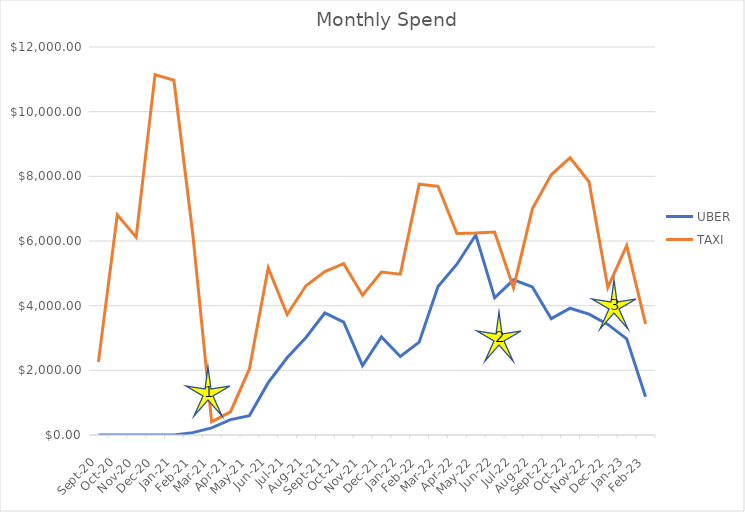
| Category | UBER | TAXI |
|---|---|---|
| 2020-09-01 | 0 | 2261.5 |
| 2020-10-01 | 0 | 6810.3 |
| 2020-11-01 | 0 | 6119.6 |
| 2020-12-01 | 0 | 11144.6 |
| 2021-01-01 | 0 | 10971.5 |
| 2021-02-01 | 73.1 | 6218 |
| 2021-03-01 | 218.64 | 406.5 |
| 2021-04-01 | 476.11 | 714 |
| 2021-05-01 | 598.13 | 2043 |
| 2021-06-01 | 1618.72 | 5170.3 |
| 2021-07-01 | 2388.37 | 3724.5 |
| 2021-08-01 | 3017.75 | 4617.5 |
| 2021-09-01 | 3774.34 | 5056.5 |
| 2021-10-01 | 3492.27 | 5300.3 |
| 2021-11-01 | 2147.85 | 4323.3 |
| 2021-12-01 | 3032.66 | 5040 |
| 2022-01-01 | 2426.53 | 4973.9 |
| 2022-02-01 | 2872.53 | 7755.5 |
| 2022-03-01 | 4590.11 | 7691.3 |
| 2022-04-01 | 5282.77 | 6230.5 |
| 2022-05-01 | 6185.38 | 6246.1 |
| 2022-06-01 | 4243.07 | 6277 |
| 2022-07-01 | 4798.18 | 4549.4 |
| 2022-08-01 | 4578.69 | 6995.95 |
| 2022-09-01 | 3598.24 | 8047.45 |
| 2022-10-01 | 3921.32 | 8576 |
| 2022-11-01 | 3738.53 | 7833.65 |
| 2022-12-01 | 3419.72 | 4565.3 |
| 2023-01-01 | 2975.65 | 5856.35 |
| 2023-02-01 | 1183.13 | 3438 |